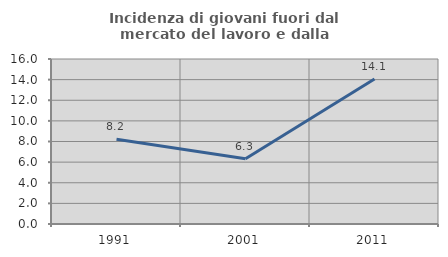
| Category | Incidenza di giovani fuori dal mercato del lavoro e dalla formazione  |
|---|---|
| 1991.0 | 8.208 |
| 2001.0 | 6.325 |
| 2011.0 | 14.062 |